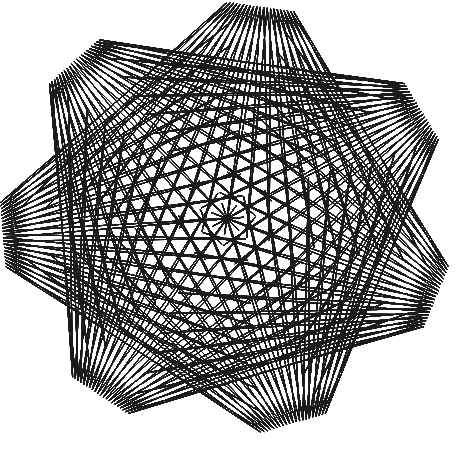
| Category | Series 0 |
|---|---|
| 6.1257422745431e-17 | 1 |
| -0.9960900029312123 | 0.06 |
| 0.014904226617617516 | 0.801 |
| -0.9938624144312767 | 0.03 |
| 0.02980845323523497 | 0.602 |
| -0.991634825931341 | 0 |
| 0.04471267985285244 | 0.403 |
| -0.9894072374314054 | -0.029 |
| 0.05961690647046989 | 0.204 |
| -0.9871796489314697 | -0.059 |
| 0.07452113308808735 | 0.006 |
| -0.9849520604315342 | -0.089 |
| 0.08942535970570481 | -0.193 |
| -0.9827244719315984 | -0.118 |
| 0.10432958632332226 | -0.392 |
| -0.9804968834316627 | -0.148 |
| 0.11923381294093972 | -0.591 |
| -0.9782692949317271 | -0.178 |
| 0.1341380395585572 | -0.79 |
| -0.9760417064317914 | -0.208 |
| 0.14904226617617464 | -0.989 |
| -0.8796378291405221 | -0.193 |
| 0.177526413470313 | -0.98 |
| -0.6890576630579194 | -0.134 |
| 0.20601056076445134 | -0.971 |
| -0.4984774969753167 | -0.076 |
| 0.23449470805858974 | -0.962 |
| -0.3078973308927139 | -0.017 |
| 0.262978855352728 | -0.954 |
| -0.11731716481011123 | 0.042 |
| 0.2914630026468664 | -0.945 |
| 0.07326300127249175 | 0.101 |
| 0.31994714994100476 | -0.936 |
| 0.26384316735509455 | 0.16 |
| 0.3484312972351431 | -0.927 |
| 0.45442333343769725 | 0.218 |
| 0.3769154445292815 | -0.919 |
| 0.6450034995203 | 0.277 |
| 0.40539959182341984 | -0.91 |
| 0.8355836656029028 | 0.336 |
| 0.4338837391175582 | -0.901 |
| 0.9234216353353955 | 0.378 |
| 0.3341633593994401 | -0.728 |
| 0.9085174087177781 | 0.404 |
| 0.23444297968132205 | -0.556 |
| 0.8936131821001606 | 0.43 |
| 0.1347225999632039 | -0.383 |
| 0.8787089554825432 | 0.456 |
| 0.03500222024508584 | -0.21 |
| 0.8638047288649258 | 0.482 |
| -0.06471815947303222 | -0.037 |
| 0.8489005022473084 | 0.507 |
| -0.1644385391911503 | 0.135 |
| 0.8339962756296908 | 0.533 |
| -0.26415891890926835 | 0.308 |
| 0.8190920490120734 | 0.559 |
| -0.3638792986273865 | 0.481 |
| 0.8041878223944559 | 0.585 |
| -0.4635996783455046 | 0.654 |
| 0.7892835957768385 | 0.611 |
| -0.5633200580636226 | 0.826 |
| 0.7087312714560823 | 0.556 |
| -0.5851712005040633 | 0.806 |
| 0.5625308494321873 | 0.42 |
| -0.6070223429445041 | 0.786 |
| 0.4163304274082924 | 0.284 |
| -0.6288734853849448 | 0.765 |
| 0.2701300053843976 | 0.149 |
| -0.6507246278253855 | 0.745 |
| 0.12392958336050264 | 0.013 |
| -0.6725757702658263 | 0.725 |
| -0.022270838663392356 | -0.123 |
| -0.694426912706267 | 0.705 |
| -0.1684712606872873 | -0.258 |
| -0.7162780551467076 | 0.684 |
| -0.3146716827111822 | -0.394 |
| -0.7381291975871486 | 0.664 |
| -0.46087210473507717 | -0.53 |
| -0.7599803400275892 | 0.644 |
| -0.607072526758972 | -0.665 |
| -0.7818314824680299 | 0.623 |
| -0.6678582878382514 | -0.741 |
| -0.6170457938427831 | 0.511 |
| -0.6432293879729154 | -0.758 |
| -0.45226010521753635 | 0.399 |
| -0.6186004881075792 | -0.775 |
| -0.28747441659228923 | 0.286 |
| -0.593971588242243 | -0.792 |
| -0.12268872796704239 | 0.174 |
| -0.5693426883769069 | -0.809 |
| 0.042096960658204396 | 0.062 |
| -0.5447137885115707 | -0.825 |
| 0.20688264928345124 | -0.051 |
| -0.5200848886462346 | -0.842 |
| 0.37166833790869813 | -0.163 |
| -0.49545598878089847 | -0.859 |
| 0.536454026533945 | -0.275 |
| -0.4708270889155623 | -0.876 |
| 0.7012397151591918 | -0.388 |
| -0.4461981890502261 | -0.893 |
| 0.8660254037844387 | -0.5 |
| -0.3974517934411349 | -0.808 |
| 0.8769156546241772 | -0.472 |
| -0.3245879020882887 | -0.622 |
| 0.8878059054639157 | -0.445 |
| -0.2517240107354425 | -0.437 |
| 0.8986961563036542 | -0.417 |
| -0.17886011938259622 | -0.251 |
| 0.9095864071433928 | -0.389 |
| -0.10599622802975 | -0.066 |
| 0.9204766579831312 | -0.361 |
| -0.03313233667690374 | 0.12 |
| 0.9313669088228698 | -0.334 |
| 0.0397315546759425 | 0.306 |
| 0.9422571596626081 | -0.306 |
| 0.11259544602878874 | 0.491 |
| 0.9531474105023467 | -0.278 |
| 0.18545933738163495 | 0.677 |
| 0.9640376613420851 | -0.25 |
| 0.2583232287344812 | 0.863 |
| 0.9749279121818236 | -0.223 |
| 0.2800174156903591 | 0.958 |
| 0.7777147412455233 | -0.193 |
| 0.25054189824926865 | 0.962 |
| 0.580501570309223 | -0.163 |
| 0.22106638080817828 | 0.967 |
| 0.3832883993729224 | -0.133 |
| 0.19159086336708783 | 0.971 |
| 0.1860752284366221 | -0.104 |
| 0.1621153459259974 | 0.976 |
| -0.011137942499678255 | -0.074 |
| 0.13263982848490696 | 0.98 |
| -0.20835111343597862 | -0.044 |
| 0.10316431104381654 | 0.984 |
| -0.405564284372279 | -0.014 |
| 0.07368879360272612 | 0.989 |
| -0.6027774553085794 | 0.015 |
| 0.0442132761616357 | 0.993 |
| -0.7999906262448798 | 0.045 |
| 0.014737758720545276 | 0.998 |
| -0.9972037971811801 | 0.075 |
| 0.007452113308808797 | 0.901 |
| -0.9949762086812445 | 0.045 |
| 0.02235633992642625 | 0.702 |
| -0.9927486201813088 | 0.015 |
| 0.03726056654404371 | 0.503 |
| -0.9905210316813733 | -0.014 |
| 0.052164793161661165 | 0.304 |
| -0.9882934431814376 | -0.044 |
| 0.06706901977927861 | 0.105 |
| -0.9860658546815019 | -0.074 |
| 0.08197324639689609 | -0.094 |
| -0.9838382661815663 | -0.104 |
| 0.09687747301451355 | -0.293 |
| -0.9816106776816306 | -0.133 |
| 0.11178169963213098 | -0.492 |
| -0.979383089181695 | -0.163 |
| 0.12668592624974845 | -0.691 |
| -0.9771555006817593 | -0.193 |
| 0.1415901528673659 | -0.889 |
| -0.9749279121818236 | -0.223 |
| 0.16328433982324383 | -0.984 |
| -0.7843477460992209 | -0.164 |
| 0.1917684871173822 | -0.976 |
| -0.5937675800166181 | -0.105 |
| 0.22025263441152051 | -0.967 |
| -0.4031874139340152 | -0.046 |
| 0.24873678170565888 | -0.958 |
| -0.2126072478514125 | 0.013 |
| 0.2772209289997972 | -0.949 |
| -0.022027081768809686 | 0.071 |
| 0.3057050762939356 | -0.941 |
| 0.16855308431379307 | 0.13 |
| 0.33418922358807396 | -0.932 |
| 0.3591332503963959 | 0.189 |
| 0.3626733708822123 | -0.923 |
| 0.5497134164789986 | 0.248 |
| 0.39115751817635064 | -0.914 |
| 0.7402935825616015 | 0.307 |
| 0.419641665470489 | -0.905 |
| 0.9308737486442042 | 0.365 |
| 0.3840235492584991 | -0.815 |
| 0.9159695220265868 | 0.391 |
| 0.28430316954038104 | -0.642 |
| 0.9010652954089693 | 0.417 |
| 0.184582789822263 | -0.469 |
| 0.8861610687913519 | 0.443 |
| 0.08486241010414494 | -0.296 |
| 0.8712568421737346 | 0.469 |
| -0.014857969613973121 | -0.124 |
| 0.856352615556117 | 0.494 |
| -0.1145783493320913 | 0.049 |
| 0.8414483889384996 | 0.52 |
| -0.21429872905020933 | 0.222 |
| 0.8265441623208821 | 0.546 |
| -0.3140191087683274 | 0.394 |
| 0.8116399357032648 | 0.572 |
| -0.4137394884864455 | 0.567 |
| 0.7967357090856473 | 0.598 |
| -0.5134598682045636 | 0.74 |
| 0.7818314824680298 | 0.623 |
| -0.5742456292838429 | 0.816 |
| 0.6356310604441349 | 0.488 |
| -0.5960967717242838 | 0.796 |
| 0.48943063842024004 | 0.352 |
| -0.6179479141647244 | 0.776 |
| 0.343230216396345 | 0.217 |
| -0.6397990566051651 | 0.755 |
| 0.19702979437245 | 0.081 |
| -0.6616501990456058 | 0.735 |
| 0.05082937234855511 | -0.055 |
| -0.6835013414860467 | 0.715 |
| -0.09537104967533977 | -0.19 |
| -0.7053524839264874 | 0.694 |
| -0.24157147169923474 | -0.326 |
| -0.7272036263669281 | 0.674 |
| -0.3877718937231297 | -0.462 |
| -0.7490547688073688 | 0.654 |
| -0.5339723157470246 | -0.597 |
| -0.7709059112478095 | 0.634 |
| -0.6801727377709196 | -0.733 |
| -0.6994386381554063 | 0.567 |
| -0.6555438379055833 | -0.75 |
| -0.5346529495301595 | 0.455 |
| -0.6309149380402473 | -0.767 |
| -0.36986726090491273 | 0.343 |
| -0.6062860381749111 | -0.783 |
| -0.20508157227966595 | 0.23 |
| -0.581657138309575 | -0.8 |
| -0.04029588365441911 | 0.118 |
| -0.5570282384442389 | -0.817 |
| 0.12448980497082784 | 0.006 |
| -0.5323993385789028 | -0.834 |
| 0.28927549359607474 | -0.107 |
| -0.5077704387135664 | -0.851 |
| 0.4540611822213215 | -0.219 |
| -0.4831415388482304 | -0.867 |
| 0.6188468708465684 | -0.331 |
| -0.4585126389828942 | -0.884 |
| 0.7836325594718153 | -0.444 |
| -0.43388373911755806 | -0.901 |
| 0.871470529204308 | -0.486 |
| -0.3610198477647118 | -0.715 |
| 0.8823607800440464 | -0.458 |
| -0.28815595641186564 | -0.53 |
| 0.8932510308837849 | -0.431 |
| -0.21529206505901932 | -0.344 |
| 0.9041412817235235 | -0.403 |
| -0.1424281737061731 | -0.158 |
| 0.9150315325632619 | -0.375 |
| -0.06956428235332687 | 0.027 |
| 0.9259217834030005 | -0.347 |
| 0.003299608999519338 | 0.213 |
| 0.936812034242739 | -0.32 |
| 0.07616350035236558 | 0.399 |
| 0.9477022850824774 | -0.292 |
| 0.14902739170521184 | 0.584 |
| 0.9585925359222158 | -0.264 |
| 0.22189128305805805 | 0.77 |
| 0.9694827867619543 | -0.236 |
| 0.2947551744109043 | 0.956 |
| 0.8763213267136734 | -0.208 |
| 0.26527965696981387 | 0.96 |
| 0.679108155777373 | -0.178 |
| 0.23580413952872348 | 0.964 |
| 0.48189498484107274 | -0.148 |
| 0.20632862208763303 | 0.969 |
| 0.2846818139047724 | -0.118 |
| 0.1768531046465426 | 0.973 |
| 0.08746864296847207 | -0.089 |
| 0.1473775872054522 | 0.978 |
| -0.10974452796782852 | -0.059 |
| 0.11790206976436178 | 0.982 |
| -0.3069576989041289 | -0.029 |
| 0.08842655232327133 | 0.987 |
| -0.5041708698404292 | 0 |
| 0.05895103488218092 | 0.991 |
| -0.7013840407767296 | 0.03 |
| 0.02947551744109049 | 0.996 |
| -0.8985972117130299 | 0.06 |
| 6.1257422745431e-17 | 1 |
| -0.9960900029312123 | 0.06 |
| 0.014904226617617516 | 0.801 |
| -0.9938624144312767 | 0.03 |
| 0.02980845323523497 | 0.602 |
| -0.991634825931341 | 0 |
| 0.04471267985285244 | 0.403 |
| -0.9894072374314054 | -0.029 |
| 0.05961690647046989 | 0.204 |
| -0.9871796489314697 | -0.059 |
| 0.07452113308808735 | 0.006 |
| -0.9849520604315342 | -0.089 |
| 0.08942535970570481 | -0.193 |
| -0.9827244719315984 | -0.118 |
| 0.10432958632332226 | -0.392 |
| -0.9804968834316627 | -0.148 |
| 0.11923381294093972 | -0.591 |
| -0.9782692949317271 | -0.178 |
| 0.1341380395585572 | -0.79 |
| -0.9760417064317914 | -0.208 |
| 0.14904226617617464 | -0.989 |
| -0.8796378291405221 | -0.193 |
| 0.177526413470313 | -0.98 |
| -0.6890576630579194 | -0.134 |
| 0.20601056076445134 | -0.971 |
| -0.4984774969753167 | -0.076 |
| 0.23449470805858974 | -0.962 |
| -0.3078973308927139 | -0.017 |
| 0.262978855352728 | -0.954 |
| -0.11731716481011123 | 0.042 |
| 0.2914630026468664 | -0.945 |
| 0.07326300127249175 | 0.101 |
| 0.31994714994100476 | -0.936 |
| 0.26384316735509455 | 0.16 |
| 0.3484312972351431 | -0.927 |
| 0.45442333343769725 | 0.218 |
| 0.3769154445292815 | -0.919 |
| 0.6450034995203 | 0.277 |
| 0.40539959182341984 | -0.91 |
| 0.8355836656029028 | 0.336 |
| 0.4338837391175582 | -0.901 |
| 0.9234216353353955 | 0.378 |
| 0.3341633593994401 | -0.728 |
| 0.9085174087177781 | 0.404 |
| 0.23444297968132205 | -0.556 |
| 0.8936131821001606 | 0.43 |
| 0.1347225999632039 | -0.383 |
| 0.8787089554825432 | 0.456 |
| 0.03500222024508584 | -0.21 |
| 0.8638047288649258 | 0.482 |
| -0.06471815947303222 | -0.037 |
| 0.8489005022473084 | 0.507 |
| -0.1644385391911503 | 0.135 |
| 0.8339962756296908 | 0.533 |
| -0.26415891890926835 | 0.308 |
| 0.8190920490120734 | 0.559 |
| -0.3638792986273865 | 0.481 |
| 0.8041878223944559 | 0.585 |
| -0.4635996783455046 | 0.654 |
| 0.7892835957768385 | 0.611 |
| -0.5633200580636226 | 0.826 |
| 0.7087312714560823 | 0.556 |
| -0.5851712005040633 | 0.806 |
| 0.5625308494321873 | 0.42 |
| -0.6070223429445041 | 0.786 |
| 0.4163304274082924 | 0.284 |
| -0.6288734853849448 | 0.765 |
| 0.2701300053843976 | 0.149 |
| -0.6507246278253855 | 0.745 |
| 0.12392958336050264 | 0.013 |
| -0.6725757702658263 | 0.725 |
| -0.022270838663392356 | -0.123 |
| -0.694426912706267 | 0.705 |
| -0.1684712606872873 | -0.258 |
| -0.7162780551467076 | 0.684 |
| -0.3146716827111822 | -0.394 |
| -0.7381291975871486 | 0.664 |
| -0.46087210473507717 | -0.53 |
| -0.7599803400275892 | 0.644 |
| -0.607072526758972 | -0.665 |
| -0.7818314824680299 | 0.623 |
| -0.6678582878382514 | -0.741 |
| -0.6170457938427831 | 0.511 |
| -0.6432293879729154 | -0.758 |
| -0.45226010521753635 | 0.399 |
| -0.6186004881075792 | -0.775 |
| -0.28747441659228923 | 0.286 |
| -0.593971588242243 | -0.792 |
| -0.12268872796704239 | 0.174 |
| -0.5693426883769069 | -0.809 |
| 0.042096960658204396 | 0.062 |
| -0.5447137885115707 | -0.825 |
| 0.20688264928345124 | -0.051 |
| -0.5200848886462346 | -0.842 |
| 0.37166833790869813 | -0.163 |
| -0.49545598878089847 | -0.859 |
| 0.536454026533945 | -0.275 |
| -0.4708270889155623 | -0.876 |
| 0.7012397151591918 | -0.388 |
| -0.4461981890502261 | -0.893 |
| 0.8660254037844387 | -0.5 |
| -0.3974517934411349 | -0.808 |
| 0.8769156546241772 | -0.472 |
| -0.3245879020882887 | -0.622 |
| 0.8878059054639157 | -0.445 |
| -0.2517240107354425 | -0.437 |
| 0.8986961563036542 | -0.417 |
| -0.17886011938259622 | -0.251 |
| 0.9095864071433928 | -0.389 |
| -0.10599622802975 | -0.066 |
| 0.9204766579831312 | -0.361 |
| -0.03313233667690374 | 0.12 |
| 0.9313669088228698 | -0.334 |
| 0.0397315546759425 | 0.306 |
| 0.9422571596626081 | -0.306 |
| 0.11259544602878874 | 0.491 |
| 0.9531474105023467 | -0.278 |
| 0.18545933738163495 | 0.677 |
| 0.9640376613420851 | -0.25 |
| 0.2583232287344812 | 0.863 |
| 0.9749279121818236 | -0.223 |
| 0.2800174156903591 | 0.958 |
| 0.7777147412455233 | -0.193 |
| 0.25054189824926865 | 0.962 |
| 0.580501570309223 | -0.163 |
| 0.22106638080817828 | 0.967 |
| 0.3832883993729224 | -0.133 |
| 0.19159086336708783 | 0.971 |
| 0.1860752284366221 | -0.104 |
| 0.1621153459259974 | 0.976 |
| -0.011137942499678255 | -0.074 |
| 0.13263982848490696 | 0.98 |
| -0.20835111343597862 | -0.044 |
| 0.10316431104381654 | 0.984 |
| -0.405564284372279 | -0.014 |
| 0.07368879360272612 | 0.989 |
| -0.6027774553085794 | 0.015 |
| 0.0442132761616357 | 0.993 |
| -0.7999906262448798 | 0.045 |
| 0.014737758720545276 | 0.998 |
| -0.9972037971811801 | 0.075 |
| 0.007452113308808797 | 0.901 |
| -0.9949762086812445 | 0.045 |
| 0.02235633992642625 | 0.702 |
| -0.9927486201813088 | 0.015 |
| 0.03726056654404371 | 0.503 |
| -0.9905210316813733 | -0.014 |
| 0.052164793161661165 | 0.304 |
| -0.9882934431814376 | -0.044 |
| 0.06706901977927861 | 0.105 |
| -0.9860658546815019 | -0.074 |
| 0.08197324639689609 | -0.094 |
| -0.9838382661815663 | -0.104 |
| 0.09687747301451355 | -0.293 |
| -0.9816106776816306 | -0.133 |
| 0.11178169963213098 | -0.492 |
| -0.979383089181695 | -0.163 |
| 0.12668592624974845 | -0.691 |
| -0.9771555006817593 | -0.193 |
| 0.1415901528673659 | -0.889 |
| -0.9749279121818236 | -0.223 |
| 0.16328433982324383 | -0.984 |
| -0.7843477460992209 | -0.164 |
| 0.1917684871173822 | -0.976 |
| -0.5937675800166181 | -0.105 |
| 0.22025263441152051 | -0.967 |
| -0.4031874139340152 | -0.046 |
| 0.24873678170565888 | -0.958 |
| -0.2126072478514125 | 0.013 |
| 0.2772209289997972 | -0.949 |
| -0.022027081768809686 | 0.071 |
| 0.3057050762939356 | -0.941 |
| 0.16855308431379307 | 0.13 |
| 0.33418922358807396 | -0.932 |
| 0.3591332503963959 | 0.189 |
| 0.3626733708822123 | -0.923 |
| 0.5497134164789986 | 0.248 |
| 0.39115751817635064 | -0.914 |
| 0.7402935825616015 | 0.307 |
| 0.419641665470489 | -0.905 |
| 0.9308737486442042 | 0.365 |
| 0.3840235492584991 | -0.815 |
| 0.9159695220265868 | 0.391 |
| 0.28430316954038104 | -0.642 |
| 0.9010652954089693 | 0.417 |
| 0.184582789822263 | -0.469 |
| 0.8861610687913519 | 0.443 |
| 0.08486241010414494 | -0.296 |
| 0.8712568421737346 | 0.469 |
| -0.014857969613973121 | -0.124 |
| 0.856352615556117 | 0.494 |
| -0.1145783493320913 | 0.049 |
| 0.8414483889384996 | 0.52 |
| -0.21429872905020933 | 0.222 |
| 0.8265441623208821 | 0.546 |
| -0.3140191087683274 | 0.394 |
| 0.8116399357032648 | 0.572 |
| -0.4137394884864455 | 0.567 |
| 0.7967357090856473 | 0.598 |
| -0.5134598682045636 | 0.74 |
| 0.7818314824680298 | 0.623 |
| -0.5742456292838429 | 0.816 |
| 0.6356310604441349 | 0.488 |
| -0.5960967717242838 | 0.796 |
| 0.48943063842024004 | 0.352 |
| -0.6179479141647244 | 0.776 |
| 0.343230216396345 | 0.217 |
| -0.6397990566051651 | 0.755 |
| 0.19702979437245 | 0.081 |
| -0.6616501990456058 | 0.735 |
| 0.05082937234855511 | -0.055 |
| -0.6835013414860467 | 0.715 |
| -0.09537104967533977 | -0.19 |
| -0.7053524839264874 | 0.694 |
| -0.24157147169923474 | -0.326 |
| -0.7272036263669281 | 0.674 |
| -0.3877718937231297 | -0.462 |
| -0.7490547688073688 | 0.654 |
| -0.5339723157470246 | -0.597 |
| -0.7709059112478095 | 0.634 |
| -0.6801727377709196 | -0.733 |
| -0.6994386381554063 | 0.567 |
| -0.6555438379055833 | -0.75 |
| -0.5346529495301595 | 0.455 |
| -0.6309149380402473 | -0.767 |
| -0.36986726090491273 | 0.343 |
| -0.6062860381749111 | -0.783 |
| -0.20508157227966595 | 0.23 |
| -0.581657138309575 | -0.8 |
| -0.04029588365441911 | 0.118 |
| -0.5570282384442389 | -0.817 |
| 0.12448980497082784 | 0.006 |
| -0.5323993385789028 | -0.834 |
| 0.28927549359607474 | -0.107 |
| -0.5077704387135664 | -0.851 |
| 0.4540611822213215 | -0.219 |
| -0.4831415388482304 | -0.867 |
| 0.6188468708465684 | -0.331 |
| -0.4585126389828942 | -0.884 |
| 0.7836325594718153 | -0.444 |
| -0.43388373911755806 | -0.901 |
| 0.871470529204308 | -0.486 |
| -0.3610198477647118 | -0.715 |
| 0.8823607800440464 | -0.458 |
| -0.28815595641186564 | -0.53 |
| 0.8932510308837849 | -0.431 |
| -0.21529206505901932 | -0.344 |
| 0.9041412817235235 | -0.403 |
| -0.1424281737061731 | -0.158 |
| 0.9150315325632619 | -0.375 |
| -0.06956428235332687 | 0.027 |
| 0.9259217834030005 | -0.347 |
| 0.003299608999519338 | 0.213 |
| 0.936812034242739 | -0.32 |
| 0.07616350035236558 | 0.399 |
| 0.9477022850824774 | -0.292 |
| 0.14902739170521184 | 0.584 |
| 0.9585925359222158 | -0.264 |
| 0.22189128305805805 | 0.77 |
| 0.9694827867619543 | -0.236 |
| 0.2947551744109043 | 0.956 |
| 0.8763213267136734 | -0.208 |
| 0.26527965696981387 | 0.96 |
| 0.679108155777373 | -0.178 |
| 0.23580413952872348 | 0.964 |
| 0.48189498484107274 | -0.148 |
| 0.20632862208763303 | 0.969 |
| 0.2846818139047724 | -0.118 |
| 0.1768531046465426 | 0.973 |
| 0.08746864296847207 | -0.089 |
| 0.1473775872054522 | 0.978 |
| -0.10974452796782852 | -0.059 |
| 0.11790206976436178 | 0.982 |
| -0.3069576989041289 | -0.029 |
| 0.08842655232327133 | 0.987 |
| -0.5041708698404292 | 0 |
| 0.05895103488218092 | 0.991 |
| -0.7013840407767296 | 0.03 |
| 0.02947551744109049 | 0.996 |
| -0.8985972117130299 | 0.06 |
| 6.1257422745431e-17 | 1 |
| -0.9960900029312123 | 0.06 |
| 0.014904226617617516 | 0.801 |
| -0.9938624144312767 | 0.03 |
| 0.02980845323523497 | 0.602 |
| -0.991634825931341 | 0 |
| 0.04471267985285244 | 0.403 |
| -0.9894072374314054 | -0.029 |
| 0.05961690647046989 | 0.204 |
| -0.9871796489314697 | -0.059 |
| 0.07452113308808735 | 0.006 |
| -0.9849520604315342 | -0.089 |
| 0.08942535970570481 | -0.193 |
| -0.9827244719315984 | -0.118 |
| 0.10432958632332226 | -0.392 |
| -0.9804968834316627 | -0.148 |
| 0.11923381294093972 | -0.591 |
| -0.9782692949317271 | -0.178 |
| 0.1341380395585572 | -0.79 |
| -0.9760417064317914 | -0.208 |
| 0.14904226617617464 | -0.989 |
| -0.8796378291405221 | -0.193 |
| 0.177526413470313 | -0.98 |
| -0.6890576630579194 | -0.134 |
| 0.20601056076445134 | -0.971 |
| -0.4984774969753167 | -0.076 |
| 0.23449470805858974 | -0.962 |
| -0.3078973308927139 | -0.017 |
| 0.262978855352728 | -0.954 |
| -0.11731716481011123 | 0.042 |
| 0.2914630026468664 | -0.945 |
| 0.07326300127249175 | 0.101 |
| 0.31994714994100476 | -0.936 |
| 0.26384316735509455 | 0.16 |
| 0.3484312972351431 | -0.927 |
| 0.45442333343769725 | 0.218 |
| 0.3769154445292815 | -0.919 |
| 0.6450034995203 | 0.277 |
| 0.40539959182341984 | -0.91 |
| 0.8355836656029028 | 0.336 |
| 0.4338837391175582 | -0.901 |
| 0.9234216353353955 | 0.378 |
| 0.3341633593994401 | -0.728 |
| 0.9085174087177781 | 0.404 |
| 0.23444297968132205 | -0.556 |
| 0.8936131821001606 | 0.43 |
| 0.1347225999632039 | -0.383 |
| 0.8787089554825432 | 0.456 |
| 0.03500222024508584 | -0.21 |
| 0.8638047288649258 | 0.482 |
| -0.06471815947303222 | -0.037 |
| 0.8489005022473084 | 0.507 |
| -0.1644385391911503 | 0.135 |
| 0.8339962756296908 | 0.533 |
| -0.26415891890926835 | 0.308 |
| 0.8190920490120734 | 0.559 |
| -0.3638792986273865 | 0.481 |
| 0.8041878223944559 | 0.585 |
| -0.4635996783455046 | 0.654 |
| 0.7892835957768385 | 0.611 |
| -0.5633200580636226 | 0.826 |
| 0.7087312714560823 | 0.556 |
| -0.5851712005040633 | 0.806 |
| 0.5625308494321873 | 0.42 |
| -0.6070223429445041 | 0.786 |
| 0.4163304274082924 | 0.284 |
| -0.6288734853849448 | 0.765 |
| 0.2701300053843976 | 0.149 |
| -0.6507246278253855 | 0.745 |
| 0.12392958336050264 | 0.013 |
| -0.6725757702658263 | 0.725 |
| -0.022270838663392356 | -0.123 |
| -0.694426912706267 | 0.705 |
| -0.1684712606872873 | -0.258 |
| -0.7162780551467076 | 0.684 |
| -0.3146716827111822 | -0.394 |
| -0.7381291975871486 | 0.664 |
| -0.46087210473507717 | -0.53 |
| -0.7599803400275892 | 0.644 |
| -0.607072526758972 | -0.665 |
| -0.7818314824680299 | 0.623 |
| -0.6678582878382514 | -0.741 |
| -0.6170457938427831 | 0.511 |
| -0.6432293879729154 | -0.758 |
| -0.45226010521753635 | 0.399 |
| -0.6186004881075792 | -0.775 |
| -0.28747441659228923 | 0.286 |
| -0.593971588242243 | -0.792 |
| -0.12268872796704239 | 0.174 |
| -0.5693426883769069 | -0.809 |
| 0.042096960658204396 | 0.062 |
| -0.5447137885115707 | -0.825 |
| 0.20688264928345124 | -0.051 |
| -0.5200848886462346 | -0.842 |
| 0.37166833790869813 | -0.163 |
| -0.49545598878089847 | -0.859 |
| 0.536454026533945 | -0.275 |
| -0.4708270889155623 | -0.876 |
| 0.7012397151591918 | -0.388 |
| -0.4461981890502261 | -0.893 |
| 0.8660254037844387 | -0.5 |
| -0.3974517934411349 | -0.808 |
| 0.8769156546241772 | -0.472 |
| -0.3245879020882887 | -0.622 |
| 0.8878059054639157 | -0.445 |
| -0.2517240107354425 | -0.437 |
| 0.8986961563036542 | -0.417 |
| -0.17886011938259622 | -0.251 |
| 0.9095864071433928 | -0.389 |
| -0.10599622802975 | -0.066 |
| 0.9204766579831312 | -0.361 |
| -0.03313233667690374 | 0.12 |
| 0.9313669088228698 | -0.334 |
| 0.0397315546759425 | 0.306 |
| 0.9422571596626081 | -0.306 |
| 0.11259544602878874 | 0.491 |
| 0.9531474105023467 | -0.278 |
| 0.18545933738163495 | 0.677 |
| 0.9640376613420851 | -0.25 |
| 0.2583232287344812 | 0.863 |
| 0.9749279121818236 | -0.223 |
| 0.2800174156903591 | 0.958 |
| 0.7777147412455233 | -0.193 |
| 0.25054189824926865 | 0.962 |
| 0.580501570309223 | -0.163 |
| 0.22106638080817828 | 0.967 |
| 0.3832883993729224 | -0.133 |
| 0.19159086336708783 | 0.971 |
| 0.1860752284366221 | -0.104 |
| 0.1621153459259974 | 0.976 |
| -0.011137942499678255 | -0.074 |
| 0.13263982848490696 | 0.98 |
| -0.20835111343597862 | -0.044 |
| 0.10316431104381654 | 0.984 |
| -0.405564284372279 | -0.014 |
| 0.07368879360272612 | 0.989 |
| -0.6027774553085794 | 0.015 |
| 0.0442132761616357 | 0.993 |
| -0.7999906262448798 | 0.045 |
| 0.014737758720545276 | 0.998 |
| -0.9972037971811801 | 0.075 |
| 0.007452113308808797 | 0.901 |
| -0.9949762086812445 | 0.045 |
| 0.02235633992642625 | 0.702 |
| -0.9927486201813088 | 0.015 |
| 0.03726056654404371 | 0.503 |
| -0.9905210316813733 | -0.014 |
| 0.052164793161661165 | 0.304 |
| -0.9882934431814376 | -0.044 |
| 0.06706901977927861 | 0.105 |
| -0.9860658546815019 | -0.074 |
| 0.08197324639689609 | -0.094 |
| -0.9838382661815663 | -0.104 |
| 0.09687747301451355 | -0.293 |
| -0.9816106776816306 | -0.133 |
| 0.11178169963213098 | -0.492 |
| -0.979383089181695 | -0.163 |
| 0.12668592624974845 | -0.691 |
| -0.9771555006817593 | -0.193 |
| 0.1415901528673659 | -0.889 |
| -0.9749279121818236 | -0.223 |
| 0.16328433982324383 | -0.984 |
| -0.7843477460992209 | -0.164 |
| 0.1917684871173822 | -0.976 |
| -0.5937675800166181 | -0.105 |
| 0.22025263441152051 | -0.967 |
| -0.4031874139340152 | -0.046 |
| 0.24873678170565888 | -0.958 |
| -0.2126072478514125 | 0.013 |
| 0.2772209289997972 | -0.949 |
| -0.022027081768809686 | 0.071 |
| 0.3057050762939356 | -0.941 |
| 0.16855308431379307 | 0.13 |
| 0.33418922358807396 | -0.932 |
| 0.3591332503963959 | 0.189 |
| 0.3626733708822123 | -0.923 |
| 0.5497134164789986 | 0.248 |
| 0.39115751817635064 | -0.914 |
| 0.7402935825616015 | 0.307 |
| 0.419641665470489 | -0.905 |
| 0.9308737486442042 | 0.365 |
| 0.3840235492584991 | -0.815 |
| 0.9159695220265868 | 0.391 |
| 0.28430316954038104 | -0.642 |
| 0.9010652954089693 | 0.417 |
| 0.184582789822263 | -0.469 |
| 0.8861610687913519 | 0.443 |
| 0.08486241010414494 | -0.296 |
| 0.8712568421737346 | 0.469 |
| -0.014857969613973121 | -0.124 |
| 0.856352615556117 | 0.494 |
| -0.1145783493320913 | 0.049 |
| 0.8414483889384996 | 0.52 |
| -0.21429872905020933 | 0.222 |
| 0.8265441623208821 | 0.546 |
| -0.3140191087683274 | 0.394 |
| 0.8116399357032648 | 0.572 |
| -0.4137394884864455 | 0.567 |
| 0.7967357090856473 | 0.598 |
| -0.5134598682045636 | 0.74 |
| 0.7818314824680298 | 0.623 |
| -0.5742456292838429 | 0.816 |
| 0.6356310604441349 | 0.488 |
| -0.5960967717242838 | 0.796 |
| 0.48943063842024004 | 0.352 |
| -0.6179479141647244 | 0.776 |
| 0.343230216396345 | 0.217 |
| -0.6397990566051651 | 0.755 |
| 0.19702979437245 | 0.081 |
| -0.6616501990456058 | 0.735 |
| 0.05082937234855511 | -0.055 |
| -0.6835013414860467 | 0.715 |
| -0.09537104967533977 | -0.19 |
| -0.7053524839264874 | 0.694 |
| -0.24157147169923474 | -0.326 |
| -0.7272036263669281 | 0.674 |
| -0.3877718937231297 | -0.462 |
| -0.7490547688073688 | 0.654 |
| -0.5339723157470246 | -0.597 |
| -0.7709059112478095 | 0.634 |
| -0.6801727377709196 | -0.733 |
| -0.6994386381554063 | 0.567 |
| -0.6555438379055833 | -0.75 |
| -0.5346529495301595 | 0.455 |
| -0.6309149380402473 | -0.767 |
| -0.36986726090491273 | 0.343 |
| -0.6062860381749111 | -0.783 |
| -0.20508157227966595 | 0.23 |
| -0.581657138309575 | -0.8 |
| -0.04029588365441911 | 0.118 |
| -0.5570282384442389 | -0.817 |
| 0.12448980497082784 | 0.006 |
| -0.5323993385789028 | -0.834 |
| 0.28927549359607474 | -0.107 |
| -0.5077704387135664 | -0.851 |
| 0.4540611822213215 | -0.219 |
| -0.4831415388482304 | -0.867 |
| 0.6188468708465684 | -0.331 |
| -0.4585126389828942 | -0.884 |
| 0.7836325594718153 | -0.444 |
| -0.43388373911755806 | -0.901 |
| 0.871470529204308 | -0.486 |
| -0.3610198477647118 | -0.715 |
| 0.8823607800440464 | -0.458 |
| -0.28815595641186564 | -0.53 |
| 0.8932510308837849 | -0.431 |
| -0.21529206505901932 | -0.344 |
| 0.9041412817235235 | -0.403 |
| -0.1424281737061731 | -0.158 |
| 0.9150315325632619 | -0.375 |
| -0.06956428235332687 | 0.027 |
| 0.9259217834030005 | -0.347 |
| 0.003299608999519338 | 0.213 |
| 0.936812034242739 | -0.32 |
| 0.07616350035236558 | 0.399 |
| 0.9477022850824774 | -0.292 |
| 0.14902739170521184 | 0.584 |
| 0.9585925359222158 | -0.264 |
| 0.22189128305805805 | 0.77 |
| 0.9694827867619543 | -0.236 |
| 0.2947551744109043 | 0.956 |
| 0.8763213267136734 | -0.208 |
| 0.26527965696981387 | 0.96 |
| 0.679108155777373 | -0.178 |
| 0.23580413952872348 | 0.964 |
| 0.48189498484107274 | -0.148 |
| 0.20632862208763303 | 0.969 |
| 0.2846818139047724 | -0.118 |
| 0.1768531046465426 | 0.973 |
| 0.08746864296847207 | -0.089 |
| 0.1473775872054522 | 0.978 |
| -0.10974452796782852 | -0.059 |
| 0.11790206976436178 | 0.982 |
| -0.3069576989041289 | -0.029 |
| 0.08842655232327133 | 0.987 |
| -0.5041708698404292 | 0 |
| 0.05895103488218092 | 0.991 |
| -0.7013840407767296 | 0.03 |
| 0.02947551744109049 | 0.996 |
| -0.8985972117130299 | 0.06 |
| 6.1257422745431e-17 | 1 |
| -0.9960900029312123 | 0.06 |
| 0.014904226617617516 | 0.801 |
| -0.9938624144312767 | 0.03 |
| 0.02980845323523497 | 0.602 |
| -0.991634825931341 | 0 |
| 0.04471267985285244 | 0.403 |
| -0.9894072374314054 | -0.029 |
| 0.05961690647046989 | 0.204 |
| -0.9871796489314697 | -0.059 |
| 0.07452113308808735 | 0.006 |
| -0.9849520604315342 | -0.089 |
| 0.08942535970570481 | -0.193 |
| -0.9827244719315984 | -0.118 |
| 0.10432958632332226 | -0.392 |
| -0.9804968834316627 | -0.148 |
| 0.11923381294093972 | -0.591 |
| -0.9782692949317271 | -0.178 |
| 0.1341380395585572 | -0.79 |
| -0.9760417064317914 | -0.208 |
| 0.14904226617617464 | -0.989 |
| -0.8796378291405221 | -0.193 |
| 0.177526413470313 | -0.98 |
| -0.6890576630579194 | -0.134 |
| 0.20601056076445134 | -0.971 |
| -0.4984774969753167 | -0.076 |
| 0.23449470805858974 | -0.962 |
| -0.3078973308927139 | -0.017 |
| 0.262978855352728 | -0.954 |
| -0.11731716481011123 | 0.042 |
| 0.2914630026468664 | -0.945 |
| 0.07326300127249175 | 0.101 |
| 0.31994714994100476 | -0.936 |
| 0.26384316735509455 | 0.16 |
| 0.3484312972351431 | -0.927 |
| 0.45442333343769725 | 0.218 |
| 0.3769154445292815 | -0.919 |
| 0.6450034995203 | 0.277 |
| 0.40539959182341984 | -0.91 |
| 0.8355836656029028 | 0.336 |
| 0.4338837391175582 | -0.901 |
| 0.9234216353353955 | 0.378 |
| 0.3341633593994401 | -0.728 |
| 0.9085174087177781 | 0.404 |
| 0.23444297968132205 | -0.556 |
| 0.8936131821001606 | 0.43 |
| 0.1347225999632039 | -0.383 |
| 0.8787089554825432 | 0.456 |
| 0.03500222024508584 | -0.21 |
| 0.8638047288649258 | 0.482 |
| -0.06471815947303222 | -0.037 |
| 0.8489005022473084 | 0.507 |
| -0.1644385391911503 | 0.135 |
| 0.8339962756296908 | 0.533 |
| -0.26415891890926835 | 0.308 |
| 0.8190920490120734 | 0.559 |
| -0.3638792986273865 | 0.481 |
| 0.8041878223944559 | 0.585 |
| -0.4635996783455046 | 0.654 |
| 0.7892835957768385 | 0.611 |
| -0.5633200580636226 | 0.826 |
| 0.7087312714560823 | 0.556 |
| -0.5851712005040633 | 0.806 |
| 0.5625308494321873 | 0.42 |
| -0.6070223429445041 | 0.786 |
| 0.4163304274082924 | 0.284 |
| -0.6288734853849448 | 0.765 |
| 0.2701300053843976 | 0.149 |
| -0.6507246278253855 | 0.745 |
| 0.12392958336050264 | 0.013 |
| -0.6725757702658263 | 0.725 |
| -0.022270838663392356 | -0.123 |
| -0.694426912706267 | 0.705 |
| -0.1684712606872873 | -0.258 |
| -0.7162780551467076 | 0.684 |
| -0.3146716827111822 | -0.394 |
| -0.7381291975871486 | 0.664 |
| -0.46087210473507717 | -0.53 |
| -0.7599803400275892 | 0.644 |
| -0.607072526758972 | -0.665 |
| -0.7818314824680299 | 0.623 |
| -0.6678582878382514 | -0.741 |
| -0.6170457938427831 | 0.511 |
| -0.6432293879729154 | -0.758 |
| -0.45226010521753635 | 0.399 |
| -0.6186004881075792 | -0.775 |
| -0.28747441659228923 | 0.286 |
| -0.593971588242243 | -0.792 |
| -0.12268872796704239 | 0.174 |
| -0.5693426883769069 | -0.809 |
| 0.042096960658204396 | 0.062 |
| -0.5447137885115707 | -0.825 |
| 0.20688264928345124 | -0.051 |
| -0.5200848886462346 | -0.842 |
| 0.37166833790869813 | -0.163 |
| -0.49545598878089847 | -0.859 |
| 0.536454026533945 | -0.275 |
| -0.4708270889155623 | -0.876 |
| 0.7012397151591918 | -0.388 |
| -0.4461981890502261 | -0.893 |
| 0.8660254037844387 | -0.5 |
| -0.3974517934411349 | -0.808 |
| 0.8769156546241772 | -0.472 |
| -0.3245879020882887 | -0.622 |
| 0.8878059054639157 | -0.445 |
| -0.2517240107354425 | -0.437 |
| 0.8986961563036542 | -0.417 |
| -0.17886011938259622 | -0.251 |
| 0.9095864071433928 | -0.389 |
| -0.10599622802975 | -0.066 |
| 0.9204766579831312 | -0.361 |
| -0.03313233667690374 | 0.12 |
| 0.9313669088228698 | -0.334 |
| 0.0397315546759425 | 0.306 |
| 0.9422571596626081 | -0.306 |
| 0.11259544602878874 | 0.491 |
| 0.9531474105023467 | -0.278 |
| 0.18545933738163495 | 0.677 |
| 0.9640376613420851 | -0.25 |
| 0.2583232287344812 | 0.863 |
| 0.9749279121818236 | -0.223 |
| 0.2800174156903591 | 0.958 |
| 0.7777147412455233 | -0.193 |
| 0.25054189824926865 | 0.962 |
| 0.580501570309223 | -0.163 |
| 0.22106638080817828 | 0.967 |
| 0.3832883993729224 | -0.133 |
| 0.19159086336708783 | 0.971 |
| 0.1860752284366221 | -0.104 |
| 0.1621153459259974 | 0.976 |
| -0.011137942499678255 | -0.074 |
| 0.13263982848490696 | 0.98 |
| -0.20835111343597862 | -0.044 |
| 0.10316431104381654 | 0.984 |
| -0.405564284372279 | -0.014 |
| 0.07368879360272612 | 0.989 |
| -0.6027774553085794 | 0.015 |
| 0.0442132761616357 | 0.993 |
| -0.7999906262448798 | 0.045 |
| 0.014737758720545276 | 0.998 |
| -0.9972037971811801 | 0.075 |
| 0.007452113308808797 | 0.901 |
| -0.9949762086812445 | 0.045 |
| 0.02235633992642625 | 0.702 |
| -0.9927486201813088 | 0.015 |
| 0.03726056654404371 | 0.503 |
| -0.9905210316813733 | -0.014 |
| 0.052164793161661165 | 0.304 |
| -0.9882934431814376 | -0.044 |
| 0.06706901977927861 | 0.105 |
| -0.9860658546815019 | -0.074 |
| 0.08197324639689609 | -0.094 |
| -0.9838382661815663 | -0.104 |
| 0.09687747301451355 | -0.293 |
| -0.9816106776816306 | -0.133 |
| 0.11178169963213098 | -0.492 |
| -0.979383089181695 | -0.163 |
| 0.12668592624974845 | -0.691 |
| -0.9771555006817593 | -0.193 |
| 0.1415901528673659 | -0.889 |
| -0.9749279121818236 | -0.223 |
| 0.16328433982324383 | -0.984 |
| -0.7843477460992209 | -0.164 |
| 0.1917684871173822 | -0.976 |
| -0.5937675800166181 | -0.105 |
| 0.22025263441152051 | -0.967 |
| -0.4031874139340152 | -0.046 |
| 0.24873678170565888 | -0.958 |
| -0.2126072478514125 | 0.013 |
| 0.2772209289997972 | -0.949 |
| -0.022027081768809686 | 0.071 |
| 0.3057050762939356 | -0.941 |
| 0.16855308431379307 | 0.13 |
| 0.33418922358807396 | -0.932 |
| 0.3591332503963959 | 0.189 |
| 0.3626733708822123 | -0.923 |
| 0.5497134164789986 | 0.248 |
| 0.39115751817635064 | -0.914 |
| 0.7402935825616015 | 0.307 |
| 0.419641665470489 | -0.905 |
| 0.9308737486442042 | 0.365 |
| 0.3840235492584991 | -0.815 |
| 0.9159695220265868 | 0.391 |
| 0.28430316954038104 | -0.642 |
| 0.9010652954089693 | 0.417 |
| 0.184582789822263 | -0.469 |
| 0.8861610687913519 | 0.443 |
| 0.08486241010414494 | -0.296 |
| 0.8712568421737346 | 0.469 |
| -0.014857969613973121 | -0.124 |
| 0.856352615556117 | 0.494 |
| -0.1145783493320913 | 0.049 |
| 0.8414483889384996 | 0.52 |
| -0.21429872905020933 | 0.222 |
| 0.8265441623208821 | 0.546 |
| -0.3140191087683274 | 0.394 |
| 0.8116399357032648 | 0.572 |
| -0.4137394884864455 | 0.567 |
| 0.7967357090856473 | 0.598 |
| -0.5134598682045636 | 0.74 |
| 0.7818314824680298 | 0.623 |
| -0.5742456292838429 | 0.816 |
| 0.6356310604441349 | 0.488 |
| -0.5960967717242838 | 0.796 |
| 0.48943063842024004 | 0.352 |
| -0.6179479141647244 | 0.776 |
| 0.343230216396345 | 0.217 |
| -0.6397990566051651 | 0.755 |
| 0.19702979437245 | 0.081 |
| -0.6616501990456058 | 0.735 |
| 0.05082937234855511 | -0.055 |
| -0.6835013414860467 | 0.715 |
| -0.09537104967533977 | -0.19 |
| -0.7053524839264874 | 0.694 |
| -0.24157147169923474 | -0.326 |
| -0.7272036263669281 | 0.674 |
| -0.3877718937231297 | -0.462 |
| -0.7490547688073688 | 0.654 |
| -0.5339723157470246 | -0.597 |
| -0.7709059112478095 | 0.634 |
| -0.6801727377709196 | -0.733 |
| -0.6994386381554063 | 0.567 |
| -0.6555438379055833 | -0.75 |
| -0.5346529495301595 | 0.455 |
| -0.6309149380402473 | -0.767 |
| -0.36986726090491273 | 0.343 |
| -0.6062860381749111 | -0.783 |
| -0.20508157227966595 | 0.23 |
| -0.581657138309575 | -0.8 |
| -0.04029588365441911 | 0.118 |
| -0.5570282384442389 | -0.817 |
| 0.12448980497082784 | 0.006 |
| -0.5323993385789028 | -0.834 |
| 0.28927549359607474 | -0.107 |
| -0.5077704387135664 | -0.851 |
| 0.4540611822213215 | -0.219 |
| -0.4831415388482304 | -0.867 |
| 0.6188468708465684 | -0.331 |
| -0.4585126389828942 | -0.884 |
| 0.7836325594718153 | -0.444 |
| -0.43388373911755806 | -0.901 |
| 0.871470529204308 | -0.486 |
| -0.3610198477647118 | -0.715 |
| 0.8823607800440464 | -0.458 |
| -0.28815595641186564 | -0.53 |
| 0.8932510308837849 | -0.431 |
| -0.21529206505901932 | -0.344 |
| 0.9041412817235235 | -0.403 |
| -0.1424281737061731 | -0.158 |
| 0.9150315325632619 | -0.375 |
| -0.06956428235332687 | 0.027 |
| 0.9259217834030005 | -0.347 |
| 0.003299608999519338 | 0.213 |
| 0.936812034242739 | -0.32 |
| 0.07616350035236558 | 0.399 |
| 0.9477022850824774 | -0.292 |
| 0.14902739170521184 | 0.584 |
| 0.9585925359222158 | -0.264 |
| 0.22189128305805805 | 0.77 |
| 0.9694827867619543 | -0.236 |
| 0.2947551744109043 | 0.956 |
| 0.8763213267136734 | -0.208 |
| 0.26527965696981387 | 0.96 |
| 0.679108155777373 | -0.178 |
| 0.23580413952872348 | 0.964 |
| 0.48189498484107274 | -0.148 |
| 0.20632862208763303 | 0.969 |
| 0.2846818139047724 | -0.118 |
| 0.1768531046465426 | 0.973 |
| 0.08746864296847207 | -0.089 |
| 0.1473775872054522 | 0.978 |
| -0.10974452796782852 | -0.059 |
| 0.11790206976436178 | 0.982 |
| -0.3069576989041289 | -0.029 |
| 0.08842655232327133 | 0.987 |
| -0.5041708698404292 | 0 |
| 0.05895103488218092 | 0.991 |
| -0.7013840407767296 | 0.03 |
| 0.02947551744109049 | 0.996 |
| -0.8985972117130299 | 0.06 |
| 6.1257422745431e-17 | 1 |
| -0.9960900029312123 | 0.06 |
| 0.014904226617617516 | 0.801 |
| -0.9938624144312767 | 0.03 |
| 0.02980845323523497 | 0.602 |
| -0.991634825931341 | 0 |
| 0.04471267985285244 | 0.403 |
| -0.9894072374314054 | -0.029 |
| 0.05961690647046989 | 0.204 |
| -0.9871796489314697 | -0.059 |
| 0.07452113308808735 | 0.006 |
| -0.9849520604315342 | -0.089 |
| 0.08942535970570481 | -0.193 |
| -0.9827244719315984 | -0.118 |
| 0.10432958632332226 | -0.392 |
| -0.9804968834316627 | -0.148 |
| 0.11923381294093972 | -0.591 |
| -0.9782692949317271 | -0.178 |
| 0.1341380395585572 | -0.79 |
| -0.9760417064317914 | -0.208 |
| 0.14904226617617464 | -0.989 |
| -0.8796378291405221 | -0.193 |
| 0.177526413470313 | -0.98 |
| -0.6890576630579194 | -0.134 |
| 0.20601056076445134 | -0.971 |
| -0.4984774969753167 | -0.076 |
| 0.23449470805858974 | -0.962 |
| -0.3078973308927139 | -0.017 |
| 0.262978855352728 | -0.954 |
| -0.11731716481011123 | 0.042 |
| 0.2914630026468664 | -0.945 |
| 0.07326300127249175 | 0.101 |
| 0.31994714994100476 | -0.936 |
| 0.26384316735509455 | 0.16 |
| 0.3484312972351431 | -0.927 |
| 0.45442333343769725 | 0.218 |
| 0.3769154445292815 | -0.919 |
| 0.6450034995203 | 0.277 |
| 0.40539959182341984 | -0.91 |
| 0.8355836656029028 | 0.336 |
| 0.4338837391175582 | -0.901 |
| 0.9234216353353955 | 0.378 |
| 0.3341633593994401 | -0.728 |
| 0.9085174087177781 | 0.404 |
| 0.23444297968132205 | -0.556 |
| 0.8936131821001606 | 0.43 |
| 0.1347225999632039 | -0.383 |
| 0.8787089554825432 | 0.456 |
| 0.03500222024508584 | -0.21 |
| 0.8638047288649258 | 0.482 |
| -0.06471815947303222 | -0.037 |
| 0.8489005022473084 | 0.507 |
| -0.1644385391911503 | 0.135 |
| 0.8339962756296908 | 0.533 |
| -0.26415891890926835 | 0.308 |
| 0.8190920490120734 | 0.559 |
| -0.3638792986273865 | 0.481 |
| 0.8041878223944559 | 0.585 |
| -0.4635996783455046 | 0.654 |
| 0.7892835957768385 | 0.611 |
| -0.5633200580636226 | 0.826 |
| 0.7087312714560823 | 0.556 |
| -0.5851712005040633 | 0.806 |
| 0.5625308494321873 | 0.42 |
| -0.6070223429445041 | 0.786 |
| 0.4163304274082924 | 0.284 |
| -0.6288734853849448 | 0.765 |
| 0.2701300053843976 | 0.149 |
| -0.6507246278253855 | 0.745 |
| 0.12392958336050264 | 0.013 |
| -0.6725757702658263 | 0.725 |
| -0.022270838663392356 | -0.123 |
| -0.694426912706267 | 0.705 |
| -0.1684712606872873 | -0.258 |
| -0.7162780551467076 | 0.684 |
| -0.3146716827111822 | -0.394 |
| -0.7381291975871486 | 0.664 |
| -0.46087210473507717 | -0.53 |
| -0.7599803400275892 | 0.644 |
| -0.607072526758972 | -0.665 |
| -0.7818314824680299 | 0.623 |
| -0.6678582878382514 | -0.741 |
| -0.6170457938427831 | 0.511 |
| -0.6432293879729154 | -0.758 |
| -0.45226010521753635 | 0.399 |
| -0.6186004881075792 | -0.775 |
| -0.28747441659228923 | 0.286 |
| -0.593971588242243 | -0.792 |
| -0.12268872796704239 | 0.174 |
| -0.5693426883769069 | -0.809 |
| 0.042096960658204396 | 0.062 |
| -0.5447137885115707 | -0.825 |
| 0.20688264928345124 | -0.051 |
| -0.5200848886462346 | -0.842 |
| 0.37166833790869813 | -0.163 |
| -0.49545598878089847 | -0.859 |
| 0.536454026533945 | -0.275 |
| -0.4708270889155623 | -0.876 |
| 0.7012397151591918 | -0.388 |
| -0.4461981890502261 | -0.893 |
| 0.8660254037844387 | -0.5 |
| -0.3974517934411349 | -0.808 |
| 0.8769156546241772 | -0.472 |
| -0.3245879020882887 | -0.622 |
| 0.8878059054639157 | -0.445 |
| -0.2517240107354425 | -0.437 |
| 0.8986961563036542 | -0.417 |
| -0.17886011938259622 | -0.251 |
| 0.9095864071433928 | -0.389 |
| -0.10599622802975 | -0.066 |
| 0.9204766579831312 | -0.361 |
| -0.03313233667690374 | 0.12 |
| 0.9313669088228698 | -0.334 |
| 0.0397315546759425 | 0.306 |
| 0.9422571596626081 | -0.306 |
| 0.11259544602878874 | 0.491 |
| 0.9531474105023467 | -0.278 |
| 0.18545933738163495 | 0.677 |
| 0.9640376613420851 | -0.25 |
| 0.2583232287344812 | 0.863 |
| 0.9749279121818236 | -0.223 |
| 0.2800174156903591 | 0.958 |
| 0.7777147412455233 | -0.193 |
| 0.25054189824926865 | 0.962 |
| 0.580501570309223 | -0.163 |
| 0.22106638080817828 | 0.967 |
| 0.3832883993729224 | -0.133 |
| 0.19159086336708783 | 0.971 |
| 0.1860752284366221 | -0.104 |
| 0.1621153459259974 | 0.976 |
| -0.011137942499678255 | -0.074 |
| 0.13263982848490696 | 0.98 |
| -0.20835111343597862 | -0.044 |
| 0.10316431104381654 | 0.984 |
| -0.405564284372279 | -0.014 |
| 0.07368879360272612 | 0.989 |
| -0.6027774553085794 | 0.015 |
| 0.0442132761616357 | 0.993 |
| -0.7999906262448798 | 0.045 |
| 0.014737758720545276 | 0.998 |
| -0.9972037971811801 | 0.075 |
| 0.007452113308808797 | 0.901 |
| -0.9949762086812445 | 0.045 |
| 0.02235633992642625 | 0.702 |
| -0.9927486201813088 | 0.015 |
| 0.03726056654404371 | 0.503 |
| -0.9905210316813733 | -0.014 |
| 0.052164793161661165 | 0.304 |
| -0.9882934431814376 | -0.044 |
| 0.06706901977927861 | 0.105 |
| -0.9860658546815019 | -0.074 |
| 0.08197324639689609 | -0.094 |
| -0.9838382661815663 | -0.104 |
| 0.09687747301451355 | -0.293 |
| -0.9816106776816306 | -0.133 |
| 0.11178169963213098 | -0.492 |
| -0.979383089181695 | -0.163 |
| 0.12668592624974845 | -0.691 |
| -0.9771555006817593 | -0.193 |
| 0.1415901528673659 | -0.889 |
| -0.9749279121818236 | -0.223 |
| 0.16328433982324383 | -0.984 |
| -0.7843477460992209 | -0.164 |
| 0.1917684871173822 | -0.976 |
| -0.5937675800166181 | -0.105 |
| 0.22025263441152051 | -0.967 |
| -0.4031874139340152 | -0.046 |
| 0.24873678170565888 | -0.958 |
| -0.2126072478514125 | 0.013 |
| 0.2772209289997972 | -0.949 |
| -0.022027081768809686 | 0.071 |
| 0.3057050762939356 | -0.941 |
| 0.16855308431379307 | 0.13 |
| 0.33418922358807396 | -0.932 |
| 0.3591332503963959 | 0.189 |
| 0.3626733708822123 | -0.923 |
| 0.5497134164789986 | 0.248 |
| 0.39115751817635064 | -0.914 |
| 0.7402935825616015 | 0.307 |
| 0.419641665470489 | -0.905 |
| 0.9308737486442042 | 0.365 |
| 0.3840235492584991 | -0.815 |
| 0.9159695220265868 | 0.391 |
| 0.28430316954038104 | -0.642 |
| 0.9010652954089693 | 0.417 |
| 0.184582789822263 | -0.469 |
| 0.8861610687913519 | 0.443 |
| 0.08486241010414494 | -0.296 |
| 0.8712568421737346 | 0.469 |
| -0.014857969613973121 | -0.124 |
| 0.856352615556117 | 0.494 |
| -0.1145783493320913 | 0.049 |
| 0.8414483889384996 | 0.52 |
| -0.21429872905020933 | 0.222 |
| 0.8265441623208821 | 0.546 |
| -0.3140191087683274 | 0.394 |
| 0.8116399357032648 | 0.572 |
| -0.4137394884864455 | 0.567 |
| 0.7967357090856473 | 0.598 |
| -0.5134598682045636 | 0.74 |
| 0.7818314824680298 | 0.623 |
| -0.5742456292838429 | 0.816 |
| 0.6356310604441349 | 0.488 |
| -0.5960967717242838 | 0.796 |
| 0.48943063842024004 | 0.352 |
| -0.6179479141647244 | 0.776 |
| 0.343230216396345 | 0.217 |
| -0.6397990566051651 | 0.755 |
| 0.19702979437245 | 0.081 |
| -0.6616501990456058 | 0.735 |
| 0.05082937234855511 | -0.055 |
| -0.6835013414860467 | 0.715 |
| -0.09537104967533977 | -0.19 |
| -0.7053524839264874 | 0.694 |
| -0.24157147169923474 | -0.326 |
| -0.7272036263669281 | 0.674 |
| -0.3877718937231297 | -0.462 |
| -0.7490547688073688 | 0.654 |
| -0.5339723157470246 | -0.597 |
| -0.7709059112478095 | 0.634 |
| -0.6801727377709196 | -0.733 |
| -0.6994386381554063 | 0.567 |
| -0.6555438379055833 | -0.75 |
| -0.5346529495301595 | 0.455 |
| -0.6309149380402473 | -0.767 |
| -0.36986726090491273 | 0.343 |
| -0.6062860381749111 | -0.783 |
| -0.20508157227966595 | 0.23 |
| -0.581657138309575 | -0.8 |
| -0.04029588365441911 | 0.118 |
| -0.5570282384442389 | -0.817 |
| 0.12448980497082784 | 0.006 |
| -0.5323993385789028 | -0.834 |
| 0.28927549359607474 | -0.107 |
| -0.5077704387135664 | -0.851 |
| 0.4540611822213215 | -0.219 |
| -0.4831415388482304 | -0.867 |
| 0.6188468708465684 | -0.331 |
| -0.4585126389828942 | -0.884 |
| 0.7836325594718153 | -0.444 |
| -0.43388373911755806 | -0.901 |
| 0.871470529204308 | -0.486 |
| -0.3610198477647118 | -0.715 |
| 0.8823607800440464 | -0.458 |
| -0.28815595641186564 | -0.53 |
| 0.8932510308837849 | -0.431 |
| -0.21529206505901932 | -0.344 |
| 0.9041412817235235 | -0.403 |
| -0.1424281737061731 | -0.158 |
| 0.9150315325632619 | -0.375 |
| -0.06956428235332687 | 0.027 |
| 0.9259217834030005 | -0.347 |
| 0.003299608999519338 | 0.213 |
| 0.936812034242739 | -0.32 |
| 0.07616350035236558 | 0.399 |
| 0.9477022850824774 | -0.292 |
| 0.14902739170521184 | 0.584 |
| 0.9585925359222158 | -0.264 |
| 0.22189128305805805 | 0.77 |
| 0.9694827867619543 | -0.236 |
| 0.2947551744109043 | 0.956 |
| 0.8763213267136734 | -0.208 |
| 0.26527965696981387 | 0.96 |
| 0.679108155777373 | -0.178 |
| 0.23580413952872348 | 0.964 |
| 0.48189498484107274 | -0.148 |
| 0.20632862208763303 | 0.969 |
| 0.2846818139047724 | -0.118 |
| 0.1768531046465426 | 0.973 |
| 0.08746864296847207 | -0.089 |
| 0.1473775872054522 | 0.978 |
| -0.10974452796782852 | -0.059 |
| 0.11790206976436178 | 0.982 |
| -0.3069576989041289 | -0.029 |
| 0.08842655232327133 | 0.987 |
| -0.5041708698404292 | 0 |
| 0.05895103488218092 | 0.991 |
| -0.7013840407767296 | 0.03 |
| 0.02947551744109049 | 0.996 |
| -0.8985972117130299 | 0.06 |
| 6.1257422745431e-17 | 1 |
| -0.9960900029312123 | 0.06 |
| 0.014904226617617516 | 0.801 |
| -0.9938624144312767 | 0.03 |
| 0.02980845323523497 | 0.602 |
| -0.991634825931341 | 0 |
| 0.04471267985285244 | 0.403 |
| -0.9894072374314054 | -0.029 |
| 0.05961690647046989 | 0.204 |
| -0.9871796489314697 | -0.059 |
| 0.07452113308808735 | 0.006 |
| -0.9849520604315342 | -0.089 |
| 0.08942535970570481 | -0.193 |
| -0.9827244719315984 | -0.118 |
| 0.10432958632332226 | -0.392 |
| -0.9804968834316627 | -0.148 |
| 0.11923381294093972 | -0.591 |
| -0.9782692949317271 | -0.178 |
| 0.1341380395585572 | -0.79 |
| -0.9760417064317914 | -0.208 |
| 0.14904226617617464 | -0.989 |
| -0.8796378291405221 | -0.193 |
| 0.177526413470313 | -0.98 |
| -0.6890576630579194 | -0.134 |
| 0.20601056076445134 | -0.971 |
| -0.4984774969753167 | -0.076 |
| 0.23449470805858974 | -0.962 |
| -0.3078973308927139 | -0.017 |
| 0.262978855352728 | -0.954 |
| -0.11731716481011123 | 0.042 |
| 0.2914630026468664 | -0.945 |
| 0.07326300127249175 | 0.101 |
| 0.31994714994100476 | -0.936 |
| 0.26384316735509455 | 0.16 |
| 0.3484312972351431 | -0.927 |
| 0.45442333343769725 | 0.218 |
| 0.3769154445292815 | -0.919 |
| 0.6450034995203 | 0.277 |
| 0.40539959182341984 | -0.91 |
| 0.8355836656029028 | 0.336 |
| 0.4338837391175582 | -0.901 |
| 0.9234216353353955 | 0.378 |
| 0.3341633593994401 | -0.728 |
| 0.9085174087177781 | 0.404 |
| 0.23444297968132205 | -0.556 |
| 0.8936131821001606 | 0.43 |
| 0.1347225999632039 | -0.383 |
| 0.8787089554825432 | 0.456 |
| 0.03500222024508584 | -0.21 |
| 0.8638047288649258 | 0.482 |
| -0.06471815947303222 | -0.037 |
| 0.8489005022473084 | 0.507 |
| -0.1644385391911503 | 0.135 |
| 0.8339962756296908 | 0.533 |
| -0.26415891890926835 | 0.308 |
| 0.8190920490120734 | 0.559 |
| -0.3638792986273865 | 0.481 |
| 0.8041878223944559 | 0.585 |
| -0.4635996783455046 | 0.654 |
| 0.7892835957768385 | 0.611 |
| -0.5633200580636226 | 0.826 |
| 0.7087312714560823 | 0.556 |
| -0.5851712005040633 | 0.806 |
| 0.5625308494321873 | 0.42 |
| -0.6070223429445041 | 0.786 |
| 0.4163304274082924 | 0.284 |
| -0.6288734853849448 | 0.765 |
| 0.2701300053843976 | 0.149 |
| -0.6507246278253855 | 0.745 |
| 0.12392958336050264 | 0.013 |
| -0.6725757702658263 | 0.725 |
| -0.022270838663392356 | -0.123 |
| -0.694426912706267 | 0.705 |
| -0.1684712606872873 | -0.258 |
| -0.7162780551467076 | 0.684 |
| -0.3146716827111822 | -0.394 |
| -0.7381291975871486 | 0.664 |
| -0.46087210473507717 | -0.53 |
| -0.7599803400275892 | 0.644 |
| -0.607072526758972 | -0.665 |
| -0.7818314824680299 | 0.623 |
| -0.6678582878382514 | -0.741 |
| -0.6170457938427831 | 0.511 |
| -0.6432293879729154 | -0.758 |
| -0.45226010521753635 | 0.399 |
| -0.6186004881075792 | -0.775 |
| -0.28747441659228923 | 0.286 |
| -0.593971588242243 | -0.792 |
| -0.12268872796704239 | 0.174 |
| -0.5693426883769069 | -0.809 |
| 0.042096960658204396 | 0.062 |
| -0.5447137885115707 | -0.825 |
| 0.20688264928345124 | -0.051 |
| -0.5200848886462346 | -0.842 |
| 0.37166833790869813 | -0.163 |
| -0.49545598878089847 | -0.859 |
| 0.536454026533945 | -0.275 |
| -0.4708270889155623 | -0.876 |
| 0.7012397151591918 | -0.388 |
| -0.4461981890502261 | -0.893 |
| 0.8660254037844387 | -0.5 |
| -0.3974517934411349 | -0.808 |
| 0.8769156546241772 | -0.472 |
| -0.3245879020882887 | -0.622 |
| 0.8878059054639157 | -0.445 |
| -0.2517240107354425 | -0.437 |
| 0.8986961563036542 | -0.417 |
| -0.17886011938259622 | -0.251 |
| 0.9095864071433928 | -0.389 |
| -0.10599622802975 | -0.066 |
| 0.9204766579831312 | -0.361 |
| -0.03313233667690374 | 0.12 |
| 0.9313669088228698 | -0.334 |
| 0.0397315546759425 | 0.306 |
| 0.9422571596626081 | -0.306 |
| 0.11259544602878874 | 0.491 |
| 0.9531474105023467 | -0.278 |
| 0.18545933738163495 | 0.677 |
| 0.9640376613420851 | -0.25 |
| 0.2583232287344812 | 0.863 |
| 0.9749279121818236 | -0.223 |
| 0.2800174156903591 | 0.958 |
| 0.7777147412455233 | -0.193 |
| 0.25054189824926865 | 0.962 |
| 0.580501570309223 | -0.163 |
| 0.22106638080817828 | 0.967 |
| 0.3832883993729224 | -0.133 |
| 0.19159086336708783 | 0.971 |
| 0.1860752284366221 | -0.104 |
| 0.1621153459259974 | 0.976 |
| -0.011137942499678255 | -0.074 |
| 0.13263982848490696 | 0.98 |
| -0.20835111343597862 | -0.044 |
| 0.10316431104381654 | 0.984 |
| -0.405564284372279 | -0.014 |
| 0.07368879360272612 | 0.989 |
| -0.6027774553085794 | 0.015 |
| 0.0442132761616357 | 0.993 |
| -0.7999906262448798 | 0.045 |
| 0.014737758720545276 | 0.998 |
| -0.9972037971811801 | 0.075 |
| 0.007452113308808797 | 0.901 |
| -0.9949762086812445 | 0.045 |
| 0.02235633992642625 | 0.702 |
| -0.9927486201813088 | 0.015 |
| 0.03726056654404371 | 0.503 |
| -0.9905210316813733 | -0.014 |
| 0.052164793161661165 | 0.304 |
| -0.9882934431814376 | -0.044 |
| 0.06706901977927861 | 0.105 |
| -0.9860658546815019 | -0.074 |
| 0.08197324639689609 | -0.094 |
| -0.9838382661815663 | -0.104 |
| 0.09687747301451355 | -0.293 |
| -0.9816106776816306 | -0.133 |
| 0.11178169963213098 | -0.492 |
| -0.979383089181695 | -0.163 |
| 0.12668592624974845 | -0.691 |
| -0.9771555006817593 | -0.193 |
| 0.1415901528673659 | -0.889 |
| -0.9749279121818236 | -0.223 |
| 0.16328433982324383 | -0.984 |
| -0.7843477460992209 | -0.164 |
| 0.1917684871173822 | -0.976 |
| -0.5937675800166181 | -0.105 |
| 0.22025263441152051 | -0.967 |
| -0.4031874139340152 | -0.046 |
| 0.24873678170565888 | -0.958 |
| -0.2126072478514125 | 0.013 |
| 0.2772209289997972 | -0.949 |
| -0.022027081768809686 | 0.071 |
| 0.3057050762939356 | -0.941 |
| 0.16855308431379307 | 0.13 |
| 0.33418922358807396 | -0.932 |
| 0.3591332503963959 | 0.189 |
| 0.3626733708822123 | -0.923 |
| 0.5497134164789986 | 0.248 |
| 0.39115751817635064 | -0.914 |
| 0.7402935825616015 | 0.307 |
| 0.419641665470489 | -0.905 |
| 0.9308737486442042 | 0.365 |
| 0.3840235492584991 | -0.815 |
| 0.9159695220265868 | 0.391 |
| 0.28430316954038104 | -0.642 |
| 0.9010652954089693 | 0.417 |
| 0.184582789822263 | -0.469 |
| 0.8861610687913519 | 0.443 |
| 0.08486241010414494 | -0.296 |
| 0.8712568421737346 | 0.469 |
| -0.014857969613973121 | -0.124 |
| 0.856352615556117 | 0.494 |
| -0.1145783493320913 | 0.049 |
| 0.8414483889384996 | 0.52 |
| -0.21429872905020933 | 0.222 |
| 0.8265441623208821 | 0.546 |
| -0.3140191087683274 | 0.394 |
| 0.8116399357032648 | 0.572 |
| -0.4137394884864455 | 0.567 |
| 0.7967357090856473 | 0.598 |
| -0.5134598682045636 | 0.74 |
| 0.7818314824680298 | 0.623 |
| -0.5742456292838429 | 0.816 |
| 0.6356310604441349 | 0.488 |
| -0.5960967717242838 | 0.796 |
| 0.48943063842024004 | 0.352 |
| -0.6179479141647244 | 0.776 |
| 0.343230216396345 | 0.217 |
| -0.6397990566051651 | 0.755 |
| 0.19702979437245 | 0.081 |
| -0.6616501990456058 | 0.735 |
| 0.05082937234855511 | -0.055 |
| -0.6835013414860467 | 0.715 |
| -0.09537104967533977 | -0.19 |
| -0.7053524839264874 | 0.694 |
| -0.24157147169923474 | -0.326 |
| -0.7272036263669281 | 0.674 |
| -0.3877718937231297 | -0.462 |
| -0.7490547688073688 | 0.654 |
| -0.5339723157470246 | -0.597 |
| -0.7709059112478095 | 0.634 |
| -0.6801727377709196 | -0.733 |
| -0.6994386381554063 | 0.567 |
| -0.6555438379055833 | -0.75 |
| -0.5346529495301595 | 0.455 |
| -0.6309149380402473 | -0.767 |
| -0.36986726090491273 | 0.343 |
| -0.6062860381749111 | -0.783 |
| -0.20508157227966595 | 0.23 |
| -0.581657138309575 | -0.8 |
| -0.04029588365441911 | 0.118 |
| -0.5570282384442389 | -0.817 |
| 0.12448980497082784 | 0.006 |
| -0.5323993385789028 | -0.834 |
| 0.28927549359607474 | -0.107 |
| -0.5077704387135664 | -0.851 |
| 0.4540611822213215 | -0.219 |
| -0.4831415388482304 | -0.867 |
| 0.6188468708465684 | -0.331 |
| -0.4585126389828942 | -0.884 |
| 0.7836325594718153 | -0.444 |
| -0.43388373911755806 | -0.901 |
| 0.871470529204308 | -0.486 |
| -0.3610198477647118 | -0.715 |
| 0.8823607800440464 | -0.458 |
| -0.28815595641186564 | -0.53 |
| 0.8932510308837849 | -0.431 |
| -0.21529206505901932 | -0.344 |
| 0.9041412817235235 | -0.403 |
| -0.1424281737061731 | -0.158 |
| 0.9150315325632619 | -0.375 |
| -0.06956428235332687 | 0.027 |
| 0.9259217834030005 | -0.347 |
| 0.003299608999519338 | 0.213 |
| 0.936812034242739 | -0.32 |
| 0.07616350035236558 | 0.399 |
| 0.9477022850824774 | -0.292 |
| 0.14902739170521184 | 0.584 |
| 0.9585925359222158 | -0.264 |
| 0.22189128305805805 | 0.77 |
| 0.9694827867619543 | -0.236 |
| 0.2947551744109043 | 0.956 |
| 0.8763213267136734 | -0.208 |
| 0.26527965696981387 | 0.96 |
| 0.679108155777373 | -0.178 |
| 0.23580413952872348 | 0.964 |
| 0.48189498484107274 | -0.148 |
| 0.20632862208763303 | 0.969 |
| 0.2846818139047724 | -0.118 |
| 0.1768531046465426 | 0.973 |
| 0.08746864296847207 | -0.089 |
| 0.1473775872054522 | 0.978 |
| -0.10974452796782852 | -0.059 |
| 0.11790206976436178 | 0.982 |
| -0.3069576989041289 | -0.029 |
| 0.08842655232327133 | 0.987 |
| -0.5041708698404292 | 0 |
| 0.05895103488218092 | 0.991 |
| -0.7013840407767296 | 0.03 |
| 0.02947551744109049 | 0.996 |
| -0.8985972117130299 | 0.06 |
| 6.1257422745431e-17 | 1 |
| -0.9960900029312123 | 0.06 |
| 0.014904226617617516 | 0.801 |
| -0.9938624144312767 | 0.03 |
| 0.02980845323523497 | 0.602 |
| -0.991634825931341 | 0 |
| 0.04471267985285244 | 0.403 |
| -0.9894072374314054 | -0.029 |
| 0.05961690647046989 | 0.204 |
| -0.9871796489314697 | -0.059 |
| 0.07452113308808735 | 0.006 |
| -0.9849520604315342 | -0.089 |
| 0.08942535970570481 | -0.193 |
| -0.9827244719315984 | -0.118 |
| 0.10432958632332226 | -0.392 |
| -0.9804968834316627 | -0.148 |
| 0.11923381294093972 | -0.591 |
| -0.9782692949317271 | -0.178 |
| 0.1341380395585572 | -0.79 |
| -0.9760417064317914 | -0.208 |
| 0.14904226617617464 | -0.989 |
| -0.8796378291405221 | -0.193 |
| 0.177526413470313 | -0.98 |
| -0.6890576630579194 | -0.134 |
| 0.20601056076445134 | -0.971 |
| -0.4984774969753167 | -0.076 |
| 0.23449470805858974 | -0.962 |
| -0.3078973308927139 | -0.017 |
| 0.262978855352728 | -0.954 |
| -0.11731716481011123 | 0.042 |
| 0.2914630026468664 | -0.945 |
| 0.07326300127249175 | 0.101 |
| 0.31994714994100476 | -0.936 |
| 0.26384316735509455 | 0.16 |
| 0.3484312972351431 | -0.927 |
| 0.45442333343769725 | 0.218 |
| 0.3769154445292815 | -0.919 |
| 0.6450034995203 | 0.277 |
| 0.40539959182341984 | -0.91 |
| 0.8355836656029028 | 0.336 |
| 0.4338837391175582 | -0.901 |
| 0.9234216353353955 | 0.378 |
| 0.3341633593994401 | -0.728 |
| 0.9085174087177781 | 0.404 |
| 0.23444297968132205 | -0.556 |
| 0.8936131821001606 | 0.43 |
| 0.1347225999632039 | -0.383 |
| 0.8787089554825432 | 0.456 |
| 0.03500222024508584 | -0.21 |
| 0.8638047288649258 | 0.482 |
| -0.06471815947303222 | -0.037 |
| 0.8489005022473084 | 0.507 |
| -0.1644385391911503 | 0.135 |
| 0.8339962756296908 | 0.533 |
| -0.26415891890926835 | 0.308 |
| 0.8190920490120734 | 0.559 |
| -0.3638792986273865 | 0.481 |
| 0.8041878223944559 | 0.585 |
| -0.4635996783455046 | 0.654 |
| 0.7892835957768385 | 0.611 |
| -0.5633200580636226 | 0.826 |
| 0.7087312714560823 | 0.556 |
| -0.5851712005040633 | 0.806 |
| 0.5625308494321873 | 0.42 |
| -0.6070223429445041 | 0.786 |
| 0.4163304274082924 | 0.284 |
| -0.6288734853849448 | 0.765 |
| 0.2701300053843976 | 0.149 |
| -0.6507246278253855 | 0.745 |
| 0.12392958336050264 | 0.013 |
| -0.6725757702658263 | 0.725 |
| -0.022270838663392356 | -0.123 |
| -0.694426912706267 | 0.705 |
| -0.1684712606872873 | -0.258 |
| -0.7162780551467076 | 0.684 |
| -0.3146716827111822 | -0.394 |
| -0.7381291975871486 | 0.664 |
| -0.46087210473507717 | -0.53 |
| -0.7599803400275892 | 0.644 |
| -0.607072526758972 | -0.665 |
| -0.7818314824680299 | 0.623 |
| -0.6678582878382514 | -0.741 |
| -0.6170457938427831 | 0.511 |
| -0.6432293879729154 | -0.758 |
| -0.45226010521753635 | 0.399 |
| -0.6186004881075792 | -0.775 |
| -0.28747441659228923 | 0.286 |
| -0.593971588242243 | -0.792 |
| -0.12268872796704239 | 0.174 |
| -0.5693426883769069 | -0.809 |
| 0.042096960658204396 | 0.062 |
| -0.5447137885115707 | -0.825 |
| 0.20688264928345124 | -0.051 |
| -0.5200848886462346 | -0.842 |
| 0.37166833790869813 | -0.163 |
| -0.49545598878089847 | -0.859 |
| 0.536454026533945 | -0.275 |
| -0.4708270889155623 | -0.876 |
| 0.7012397151591918 | -0.388 |
| -0.4461981890502261 | -0.893 |
| 0.8660254037844387 | -0.5 |
| -0.3974517934411349 | -0.808 |
| 0.8769156546241772 | -0.472 |
| -0.3245879020882887 | -0.622 |
| 0.8878059054639157 | -0.445 |
| -0.2517240107354425 | -0.437 |
| 0.8986961563036542 | -0.417 |
| -0.17886011938259622 | -0.251 |
| 0.9095864071433928 | -0.389 |
| -0.10599622802975 | -0.066 |
| 0.9204766579831312 | -0.361 |
| -0.03313233667690374 | 0.12 |
| 0.9313669088228698 | -0.334 |
| 0.0397315546759425 | 0.306 |
| 0.9422571596626081 | -0.306 |
| 0.11259544602878874 | 0.491 |
| 0.9531474105023467 | -0.278 |
| 0.18545933738163495 | 0.677 |
| 0.9640376613420851 | -0.25 |
| 0.2583232287344812 | 0.863 |
| 0.9749279121818236 | -0.223 |
| 0.2800174156903591 | 0.958 |
| 0.7777147412455233 | -0.193 |
| 0.25054189824926865 | 0.962 |
| 0.580501570309223 | -0.163 |
| 0.22106638080817828 | 0.967 |
| 0.3832883993729224 | -0.133 |
| 0.19159086336708783 | 0.971 |
| 0.1860752284366221 | -0.104 |
| 0.1621153459259974 | 0.976 |
| -0.011137942499678255 | -0.074 |
| 0.13263982848490696 | 0.98 |
| -0.20835111343597862 | -0.044 |
| 0.10316431104381654 | 0.984 |
| -0.405564284372279 | -0.014 |
| 0.07368879360272612 | 0.989 |
| -0.6027774553085794 | 0.015 |
| 0.0442132761616357 | 0.993 |
| -0.7999906262448798 | 0.045 |
| 0.014737758720545276 | 0.998 |
| -0.9972037971811801 | 0.075 |
| 0.007452113308808797 | 0.901 |
| -0.9949762086812445 | 0.045 |
| 0.02235633992642625 | 0.702 |
| -0.9927486201813088 | 0.015 |
| 0.03726056654404371 | 0.503 |
| -0.9905210316813733 | -0.014 |
| 0.052164793161661165 | 0.304 |
| -0.9882934431814376 | -0.044 |
| 0.06706901977927861 | 0.105 |
| -0.9860658546815019 | -0.074 |
| 0.08197324639689609 | -0.094 |
| -0.9838382661815663 | -0.104 |
| 0.09687747301451355 | -0.293 |
| -0.9816106776816306 | -0.133 |
| 0.11178169963213098 | -0.492 |
| -0.979383089181695 | -0.163 |
| 0.12668592624974845 | -0.691 |
| -0.9771555006817593 | -0.193 |
| 0.1415901528673659 | -0.889 |
| -0.9749279121818236 | -0.223 |
| 0.16328433982324383 | -0.984 |
| -0.7843477460992209 | -0.164 |
| 0.1917684871173822 | -0.976 |
| -0.5937675800166181 | -0.105 |
| 0.22025263441152051 | -0.967 |
| -0.4031874139340152 | -0.046 |
| 0.24873678170565888 | -0.958 |
| -0.2126072478514125 | 0.013 |
| 0.2772209289997972 | -0.949 |
| -0.022027081768809686 | 0.071 |
| 0.3057050762939356 | -0.941 |
| 0.16855308431379307 | 0.13 |
| 0.33418922358807396 | -0.932 |
| 0.3591332503963959 | 0.189 |
| 0.3626733708822123 | -0.923 |
| 0.5497134164789986 | 0.248 |
| 0.39115751817635064 | -0.914 |
| 0.7402935825616015 | 0.307 |
| 0.419641665470489 | -0.905 |
| 0.9308737486442042 | 0.365 |
| 0.3840235492584991 | -0.815 |
| 0.9159695220265868 | 0.391 |
| 0.28430316954038104 | -0.642 |
| 0.9010652954089693 | 0.417 |
| 0.184582789822263 | -0.469 |
| 0.8861610687913519 | 0.443 |
| 0.08486241010414494 | -0.296 |
| 0.8712568421737346 | 0.469 |
| -0.014857969613973121 | -0.124 |
| 0.856352615556117 | 0.494 |
| -0.1145783493320913 | 0.049 |
| 0.8414483889384996 | 0.52 |
| -0.21429872905020933 | 0.222 |
| 0.8265441623208821 | 0.546 |
| -0.3140191087683274 | 0.394 |
| 0.8116399357032648 | 0.572 |
| -0.4137394884864455 | 0.567 |
| 0.7967357090856473 | 0.598 |
| -0.5134598682045636 | 0.74 |
| 0.7818314824680298 | 0.623 |
| -0.5742456292838429 | 0.816 |
| 0.6356310604441349 | 0.488 |
| -0.5960967717242838 | 0.796 |
| 0.48943063842024004 | 0.352 |
| -0.6179479141647244 | 0.776 |
| 0.343230216396345 | 0.217 |
| -0.6397990566051651 | 0.755 |
| 0.19702979437245 | 0.081 |
| -0.6616501990456058 | 0.735 |
| 0.05082937234855511 | -0.055 |
| -0.6835013414860467 | 0.715 |
| -0.09537104967533977 | -0.19 |
| -0.7053524839264874 | 0.694 |
| -0.24157147169923474 | -0.326 |
| -0.7272036263669281 | 0.674 |
| -0.3877718937231297 | -0.462 |
| -0.7490547688073688 | 0.654 |
| -0.5339723157470246 | -0.597 |
| -0.7709059112478095 | 0.634 |
| -0.6801727377709196 | -0.733 |
| -0.6994386381554063 | 0.567 |
| -0.6555438379055833 | -0.75 |
| -0.5346529495301595 | 0.455 |
| -0.6309149380402473 | -0.767 |
| -0.36986726090491273 | 0.343 |
| -0.6062860381749111 | -0.783 |
| -0.20508157227966595 | 0.23 |
| -0.581657138309575 | -0.8 |
| -0.04029588365441911 | 0.118 |
| -0.5570282384442389 | -0.817 |
| 0.12448980497082784 | 0.006 |
| -0.5323993385789028 | -0.834 |
| 0.28927549359607474 | -0.107 |
| -0.5077704387135664 | -0.851 |
| 0.4540611822213215 | -0.219 |
| -0.4831415388482304 | -0.867 |
| 0.6188468708465684 | -0.331 |
| -0.4585126389828942 | -0.884 |
| 0.7836325594718153 | -0.444 |
| -0.43388373911755806 | -0.901 |
| 0.871470529204308 | -0.486 |
| -0.3610198477647118 | -0.715 |
| 0.8823607800440464 | -0.458 |
| -0.28815595641186564 | -0.53 |
| 0.8932510308837849 | -0.431 |
| -0.21529206505901932 | -0.344 |
| 0.9041412817235235 | -0.403 |
| -0.1424281737061731 | -0.158 |
| 0.9150315325632619 | -0.375 |
| -0.06956428235332687 | 0.027 |
| 0.9259217834030005 | -0.347 |
| 0.003299608999519338 | 0.213 |
| 0.936812034242739 | -0.32 |
| 0.07616350035236558 | 0.399 |
| 0.9477022850824774 | -0.292 |
| 0.14902739170521184 | 0.584 |
| 0.9585925359222158 | -0.264 |
| 0.22189128305805805 | 0.77 |
| 0.9694827867619543 | -0.236 |
| 0.2947551744109043 | 0.956 |
| 0.8763213267136734 | -0.208 |
| 0.26527965696981387 | 0.96 |
| 0.679108155777373 | -0.178 |
| 0.23580413952872348 | 0.964 |
| 0.48189498484107274 | -0.148 |
| 0.20632862208763303 | 0.969 |
| 0.2846818139047724 | -0.118 |
| 0.1768531046465426 | 0.973 |
| 0.08746864296847207 | -0.089 |
| 0.1473775872054522 | 0.978 |
| -0.10974452796782852 | -0.059 |
| 0.11790206976436178 | 0.982 |
| -0.3069576989041289 | -0.029 |
| 0.08842655232327133 | 0.987 |
| -0.5041708698404292 | 0 |
| 0.05895103488218092 | 0.991 |
| -0.7013840407767296 | 0.03 |
| 0.02947551744109049 | 0.996 |
| -0.8985972117130299 | 0.06 |
| 6.1257422745431e-17 | 1 |
| -0.9960900029312123 | 0.06 |
| 0.014904226617617516 | 0.801 |
| -0.9938624144312767 | 0.03 |
| 0.02980845323523497 | 0.602 |
| -0.991634825931341 | 0 |
| 0.04471267985285244 | 0.403 |
| -0.9894072374314054 | -0.029 |
| 0.05961690647046989 | 0.204 |
| -0.9871796489314697 | -0.059 |
| 0.07452113308808735 | 0.006 |
| -0.9849520604315342 | -0.089 |
| 0.08942535970570481 | -0.193 |
| -0.9827244719315984 | -0.118 |
| 0.10432958632332226 | -0.392 |
| -0.9804968834316627 | -0.148 |
| 0.11923381294093972 | -0.591 |
| -0.9782692949317271 | -0.178 |
| 0.1341380395585572 | -0.79 |
| -0.9760417064317914 | -0.208 |
| 0.14904226617617464 | -0.989 |
| -0.8796378291405221 | -0.193 |
| 0.177526413470313 | -0.98 |
| -0.6890576630579194 | -0.134 |
| 0.20601056076445134 | -0.971 |
| -0.4984774969753167 | -0.076 |
| 0.23449470805858974 | -0.962 |
| -0.3078973308927139 | -0.017 |
| 0.262978855352728 | -0.954 |
| -0.11731716481011123 | 0.042 |
| 0.2914630026468664 | -0.945 |
| 0.07326300127249175 | 0.101 |
| 0.31994714994100476 | -0.936 |
| 0.26384316735509455 | 0.16 |
| 0.3484312972351431 | -0.927 |
| 0.45442333343769725 | 0.218 |
| 0.3769154445292815 | -0.919 |
| 0.6450034995203 | 0.277 |
| 0.40539959182341984 | -0.91 |
| 0.8355836656029028 | 0.336 |
| 0.4338837391175582 | -0.901 |
| 0.9234216353353955 | 0.378 |
| 0.3341633593994401 | -0.728 |
| 0.9085174087177781 | 0.404 |
| 0.23444297968132205 | -0.556 |
| 0.8936131821001606 | 0.43 |
| 0.1347225999632039 | -0.383 |
| 0.8787089554825432 | 0.456 |
| 0.03500222024508584 | -0.21 |
| 0.8638047288649258 | 0.482 |
| -0.06471815947303222 | -0.037 |
| 0.8489005022473084 | 0.507 |
| -0.1644385391911503 | 0.135 |
| 0.8339962756296908 | 0.533 |
| -0.26415891890926835 | 0.308 |